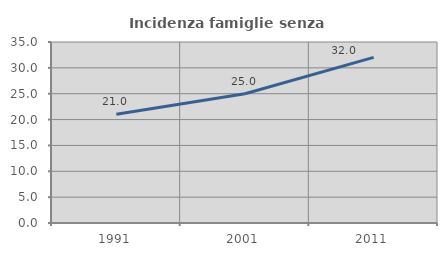
| Category | Incidenza famiglie senza nuclei |
|---|---|
| 1991.0 | 21.028 |
| 2001.0 | 25 |
| 2011.0 | 32.022 |